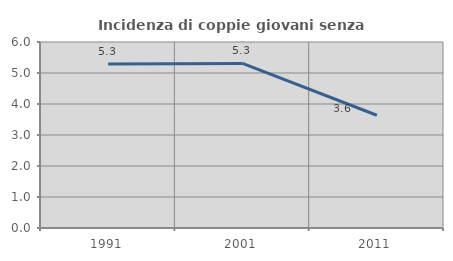
| Category | Incidenza di coppie giovani senza figli |
|---|---|
| 1991.0 | 5.286 |
| 2001.0 | 5.31 |
| 2011.0 | 3.636 |